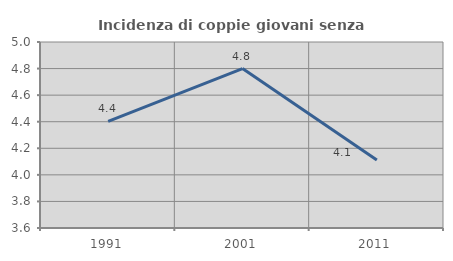
| Category | Incidenza di coppie giovani senza figli |
|---|---|
| 1991.0 | 4.403 |
| 2001.0 | 4.8 |
| 2011.0 | 4.112 |